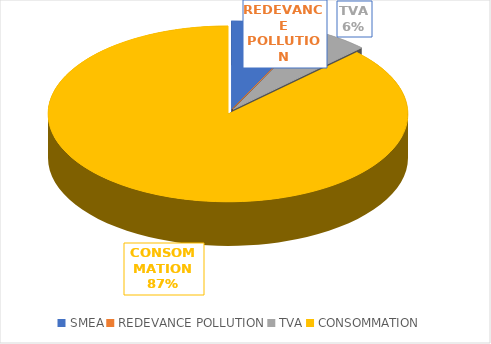
| Category | Series 0 |
|---|---|
| SMEA | 78 |
| REDEVANCE POLLUTION | 0 |
| TVA | 60.06 |
| CONSOMMATION | 953.94 |